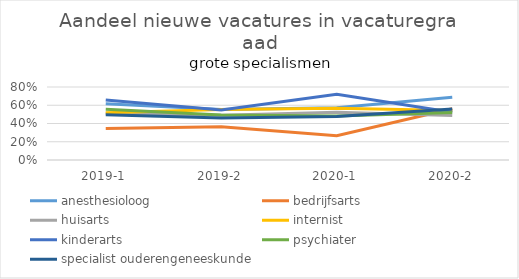
| Category | anesthesioloog | bedrijfsarts | huisarts | internist | kinderarts | psychiater | specialist ouderengeneeskunde |
|---|---|---|---|---|---|---|---|
| 2019-1 | 0.618 | 0.346 | 0.512 | 0.519 | 0.657 | 0.556 | 0.495 |
| 2019-2 | 0.555 | 0.365 | 0.489 | 0.553 | 0.548 | 0.493 | 0.461 |
| 2020-1 | 0.571 | 0.265 | 0.524 | 0.566 | 0.721 | 0.482 | 0.476 |
| 2020-2 | 0.688 | 0.561 | 0.487 | 0.542 | 0.524 | 0.522 | 0.559 |